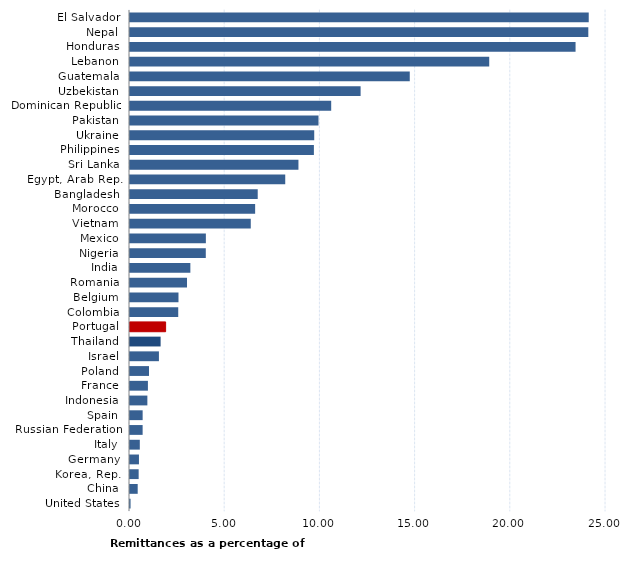
| Category | Series 0 |
|---|---|
| El Salvador | 24.093 |
| Nepal | 24.071 |
| Honduras | 23.401 |
| Lebanon | 18.867 |
| Guatemala | 14.694 |
| Uzbekistan | 12.112 |
| Dominican Republic | 10.567 |
| Pakistan | 9.9 |
| Ukraine | 9.676 |
| Philippines | 9.658 |
| Sri Lanka | 8.847 |
| Egypt, Arab Rep. | 8.154 |
| Bangladesh | 6.708 |
| Morocco | 6.573 |
| Vietnam | 6.343 |
| Mexico | 3.985 |
| Nigeria | 3.981 |
| India | 3.17 |
| Romania | 2.994 |
| Belgium | 2.546 |
| Colombia | 2.533 |
| Portugal | 1.871 |
| Thailand | 1.608 |
| Israel | 1.519 |
| Poland | 0.998 |
| France | 0.941 |
| Indonesia | 0.912 |
| Spain | 0.664 |
| Russian Federation | 0.663 |
| Italy | 0.515 |
| Germany | 0.47 |
| Korea, Rep. | 0.455 |
| China | 0.404 |
| United States | 0.029 |